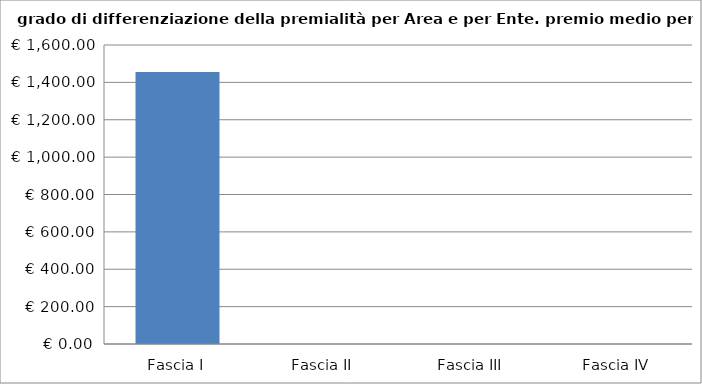
| Category | Totale ente |
|---|---|
| Fascia I | 1456 |
| Fascia II | 0 |
| Fascia III | 0 |
| Fascia IV | 0 |